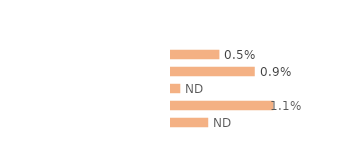
| Category | Series 0 |
|---|---|
| Personnes en emploi¹ | 0.005 |
| Chômeuses | 0.009 |
| Retraitées | 0.001 |
| Étudiantes, élèves | 0.011 |
| Autres inactifs  | 0.004 |